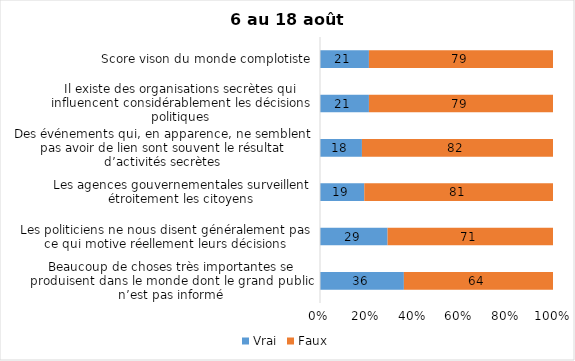
| Category | Vrai | Faux |
|---|---|---|
| Beaucoup de choses très importantes se produisent dans le monde dont le grand public n’est pas informé | 36 | 64 |
| Les politiciens ne nous disent généralement pas ce qui motive réellement leurs décisions | 29 | 71 |
| Les agences gouvernementales surveillent étroitement les citoyens | 19 | 81 |
| Des événements qui, en apparence, ne semblent pas avoir de lien sont souvent le résultat d’activités secrètes | 18 | 82 |
| Il existe des organisations secrètes qui influencent considérablement les décisions politiques | 21 | 79 |
| Score vison du monde complotiste | 21 | 79 |